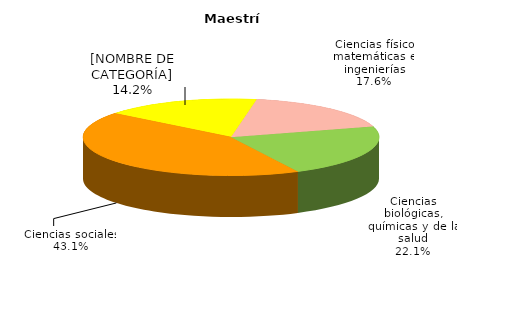
| Category | Series 0 |
|---|---|
| Ciencias físico matemáticas e ingenierías | 1544 |
| Ciencias biológicas, químicas y de la salud | 1938 |
| Ciencias sociales | 3770 |
| Humanidades y artes | 1501 |